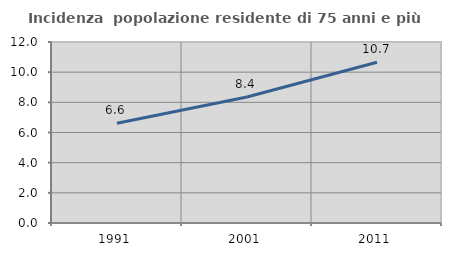
| Category | Incidenza  popolazione residente di 75 anni e più |
|---|---|
| 1991.0 | 6.618 |
| 2001.0 | 8.358 |
| 2011.0 | 10.653 |